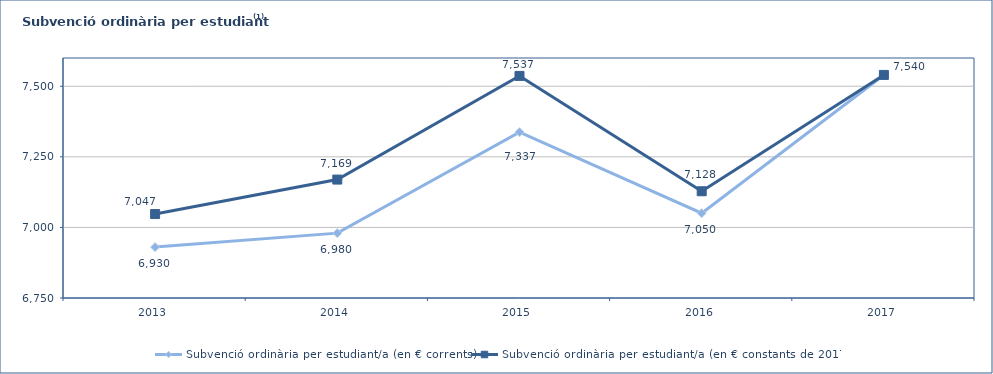
| Category | Subvenció ordinària per estudiant/a (en € corrents) | Subvenció ordinària per estudiant/a (en € constants de 2017) |
|---|---|---|
| 2013.0 | 6930.224 | 7047.374 |
| 2014.0 | 6979.758 | 7169.44 |
| 2015.0 | 7337.192 | 7536.588 |
| 2016.0 | 7050.463 | 7128.018 |
| 2017.0 | 7540.023 | 7540.023 |